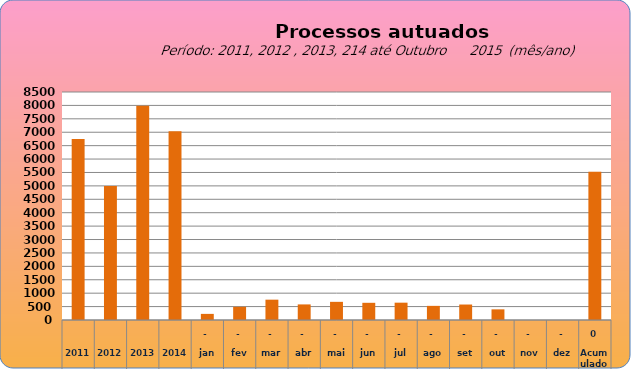
| Category | 6749 4997 7990 7034  228   486   758   581   676   641   646   527   577   397   -     -     5.517  |
|---|---|
| 2011 | 6749 |
| 2012 | 4997 |
| 2013 | 7990 |
| 2014 | 7034 |
| jan | 228 |
| fev | 492 |
| mar | 758 |
| abr | 581 |
| mai | 677 |
| jun | 641 |
| jul | 646 |
| ago | 527 |
| set | 577 |
| out | 397 |
| nov | 0 |
| dez | 0 |
| Acumulado
 | 5524 |